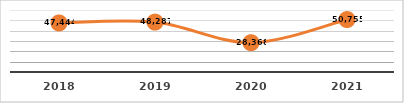
| Category | PERSONAS CAPACITADAS
PRIMER SEMESTRE, EJERCICIO 2021 |
|---|---|
| 2018.0 | 47444 |
| 2019.0 | 48287 |
| 2020.0 | 28368 |
| 2021.0 | 50755 |